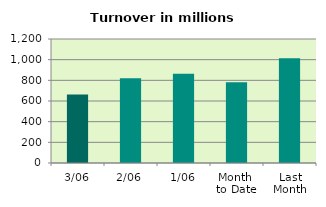
| Category | Series 0 |
|---|---|
| 3/06 | 663.268 |
| 2/06 | 820.991 |
| 1/06 | 863.328 |
| Month 
to Date | 782.529 |
| Last
Month | 1012.592 |